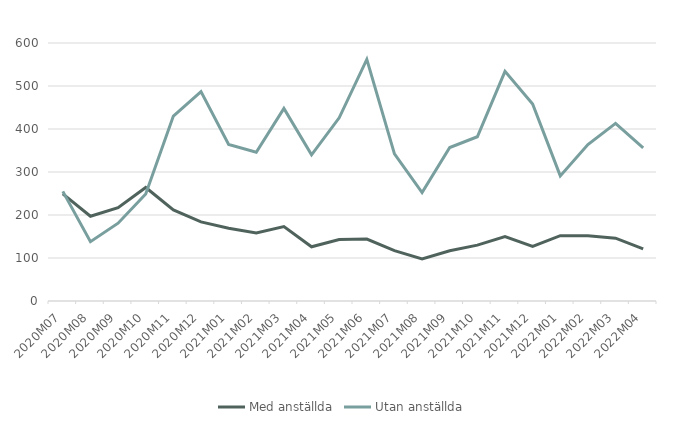
| Category | Med anställda | Utan anställda |
|---|---|---|
| 2020M07 | 249 | 255 |
| 2020M08 | 197 | 138 |
| 2020M09 | 217 | 181 |
| 2020M10 | 264 | 249 |
| 2020M11 | 212 | 430 |
| 2020M12 | 184 | 487 |
| 2021M01 | 169 | 364 |
| 2021M02 | 158 | 346 |
| 2021M03 | 173 | 448 |
| 2021M04 | 126 | 340 |
| 2021M05 | 143 | 426 |
| 2021M06 | 144 | 562 |
| 2021M07 | 117 | 342 |
| 2021M08 | 98 | 252 |
| 2021M09 | 117 | 357 |
| 2021M10 | 130 | 382 |
| 2021M11 | 150 | 534 |
| 2021M12 | 127 | 458 |
| 2022M01 | 152 | 291 |
| 2022M02 | 152 | 364 |
| 2022M03 | 146 | 413 |
| 2022M04 | 121 | 356 |